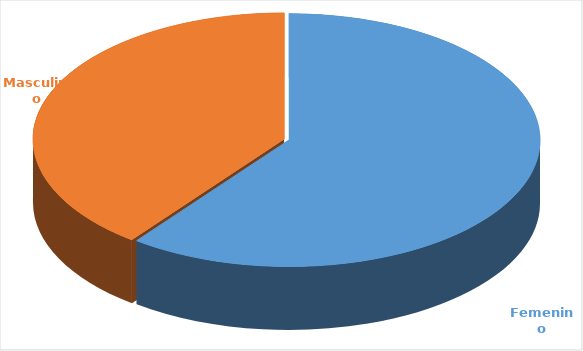
| Category | Cantidad  |
|---|---|
| Femenino | 3717 |
| Masculino | 2441 |